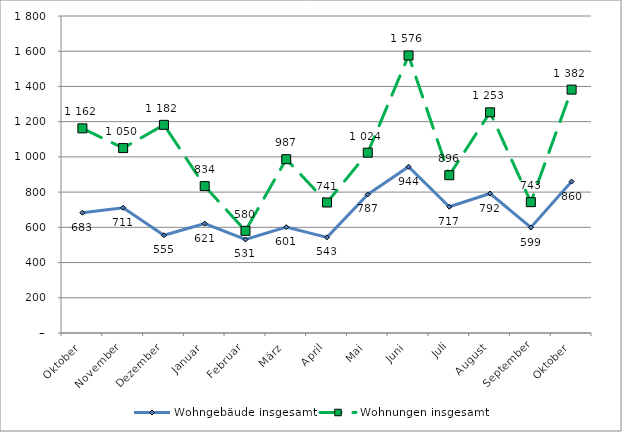
| Category | Wohngebäude insgesamt | Wohnungen insgesamt |
|---|---|---|
| Oktober | 683 | 1162 |
| November | 711 | 1050 |
| Dezember | 555 | 1182 |
| Januar | 621 | 834 |
| Februar | 531 | 580 |
| März | 601 | 987 |
| April | 543 | 741 |
| Mai | 787 | 1024 |
| Juni | 944 | 1576 |
| Juli | 717 | 896 |
| August | 792 | 1253 |
| September | 599 | 743 |
| Oktober | 860 | 1382 |